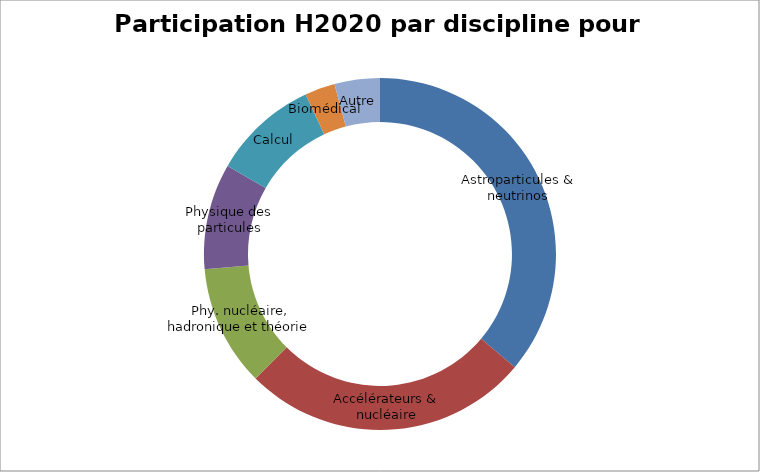
| Category | Series 0 | Series 1 |
|---|---|---|
| Astroparticules & neutrinos |  | 26 |
| Accélérateurs & nucléaire |  | 19 |
| Phy. nucléaire, hadronique et théorie |  | 8 |
| Physique des particules |  | 7 |
| Calcul |  | 7 |
| Biomédical |  | 2 |
| Autre |  | 3 |